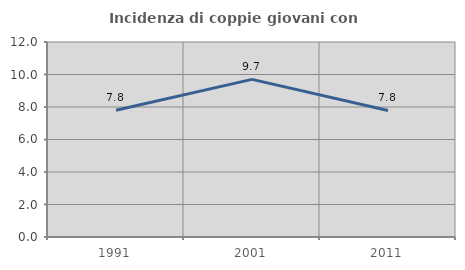
| Category | Incidenza di coppie giovani con figli |
|---|---|
| 1991.0 | 7.8 |
| 2001.0 | 9.699 |
| 2011.0 | 7.788 |